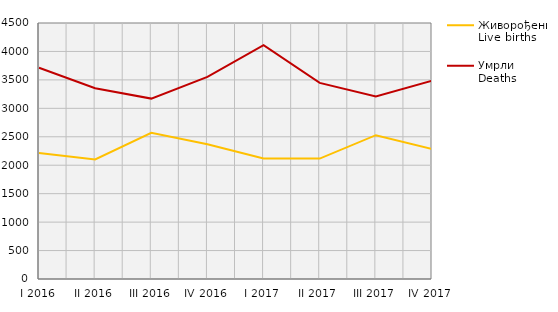
| Category | Живорођени
Live births | Умрли
Deaths |
|---|---|---|
| I 2016 | 2216 | 3714 |
| II 2016 | 2101 | 3353 |
| III 2016 | 2570 | 3171 |
| IV 2016 | 2369 | 3552 |
| I 2017 | 2118 | 4111 |
| II 2017 | 2116 | 3448 |
| III 2017 | 2528 | 3209 |
| IV 2017 | 2286 | 3486 |